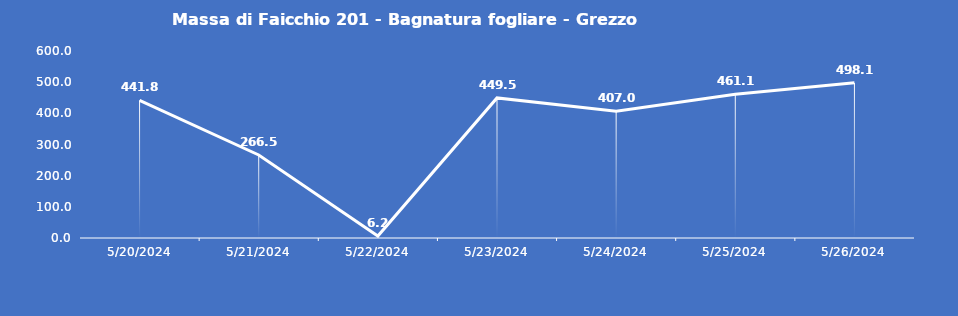
| Category | Massa di Faicchio 201 - Bagnatura fogliare - Grezzo (min) |
|---|---|
| 5/20/24 | 441.8 |
| 5/21/24 | 266.5 |
| 5/22/24 | 6.2 |
| 5/23/24 | 449.5 |
| 5/24/24 | 407 |
| 5/25/24 | 461.1 |
| 5/26/24 | 498.1 |